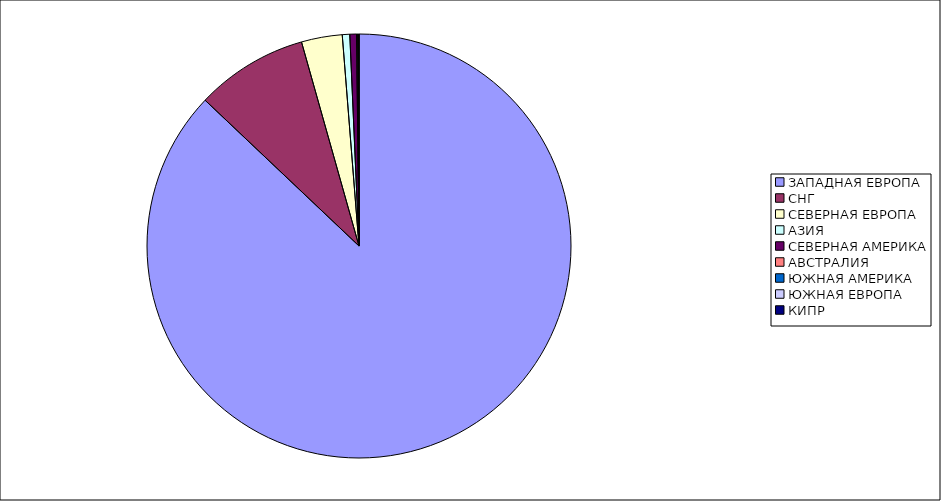
| Category | Оборот |
|---|---|
| ЗАПАДНАЯ ЕВРОПА | 0.871 |
| СНГ | 0.086 |
| СЕВЕРНАЯ ЕВРОПА | 0.031 |
| АЗИЯ | 0.006 |
| СЕВЕРНАЯ АМЕРИКА | 0.005 |
| АВСТРАЛИЯ | 0.001 |
| ЮЖНАЯ АМЕРИКА | 0.001 |
| ЮЖНАЯ ЕВРОПА | 0 |
| КИПР | 0 |